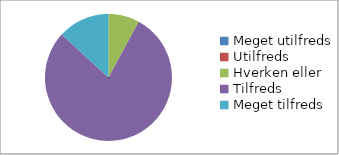
| Category | Hvor tilfreds er du med det samlede arrangement? (n=38) |
|---|---|
| Meget utilfreds | 0 |
| Utilfreds | 0 |
| Hverken eller | 0.079 |
| Tilfreds | 0.789 |
| Meget tilfreds | 0.132 |